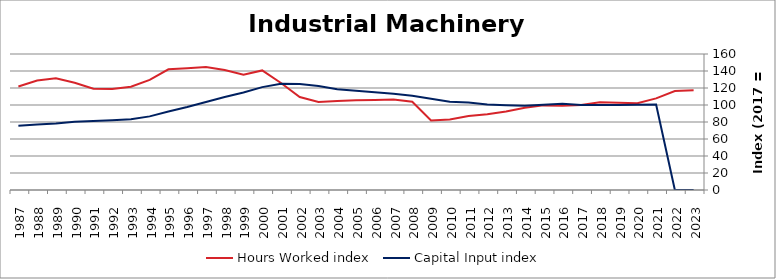
| Category | Hours Worked index | Capital Input index |
|---|---|---|
| 2023.0 | 117.401 | 0 |
| 2022.0 | 116.502 | 0 |
| 2021.0 | 107.807 | 100.495 |
| 2020.0 | 102.039 | 100.212 |
| 2019.0 | 102.625 | 99.923 |
| 2018.0 | 103.294 | 99.87 |
| 2017.0 | 100 | 100 |
| 2016.0 | 99.134 | 101.47 |
| 2015.0 | 99.555 | 100.317 |
| 2014.0 | 96.67 | 99.243 |
| 2013.0 | 92.416 | 99.812 |
| 2012.0 | 89.168 | 100.704 |
| 2011.0 | 87.001 | 103.017 |
| 2010.0 | 83.067 | 103.741 |
| 2009.0 | 81.734 | 107.294 |
| 2008.0 | 103.819 | 110.799 |
| 2007.0 | 106.486 | 113.138 |
| 2006.0 | 105.794 | 114.864 |
| 2005.0 | 105.494 | 116.81 |
| 2004.0 | 104.693 | 118.521 |
| 2003.0 | 103.641 | 122.296 |
| 2002.0 | 109.409 | 124.724 |
| 2001.0 | 125.876 | 124.977 |
| 2000.0 | 140.704 | 121.054 |
| 1999.0 | 135.518 | 114.663 |
| 1998.0 | 141.105 | 109.299 |
| 1997.0 | 144.834 | 103.428 |
| 1996.0 | 143.301 | 97.542 |
| 1995.0 | 141.947 | 92.27 |
| 1994.0 | 129.62 | 86.622 |
| 1993.0 | 121.462 | 83.317 |
| 1992.0 | 118.813 | 82.062 |
| 1991.0 | 119.196 | 81.168 |
| 1990.0 | 126.075 | 80.235 |
| 1989.0 | 131.377 | 78.252 |
| 1988.0 | 128.866 | 77.056 |
| 1987.0 | 121.704 | 75.491 |